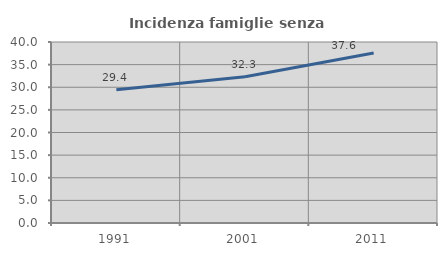
| Category | Incidenza famiglie senza nuclei |
|---|---|
| 1991.0 | 29.448 |
| 2001.0 | 32.333 |
| 2011.0 | 37.583 |